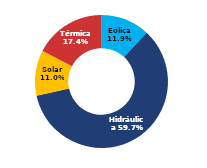
| Category | Sur |
|---|---|
| Eólica | 59.179 |
| Hidráulica | 297.4 |
| Solar | 55.024 |
| Térmica | 86.65 |